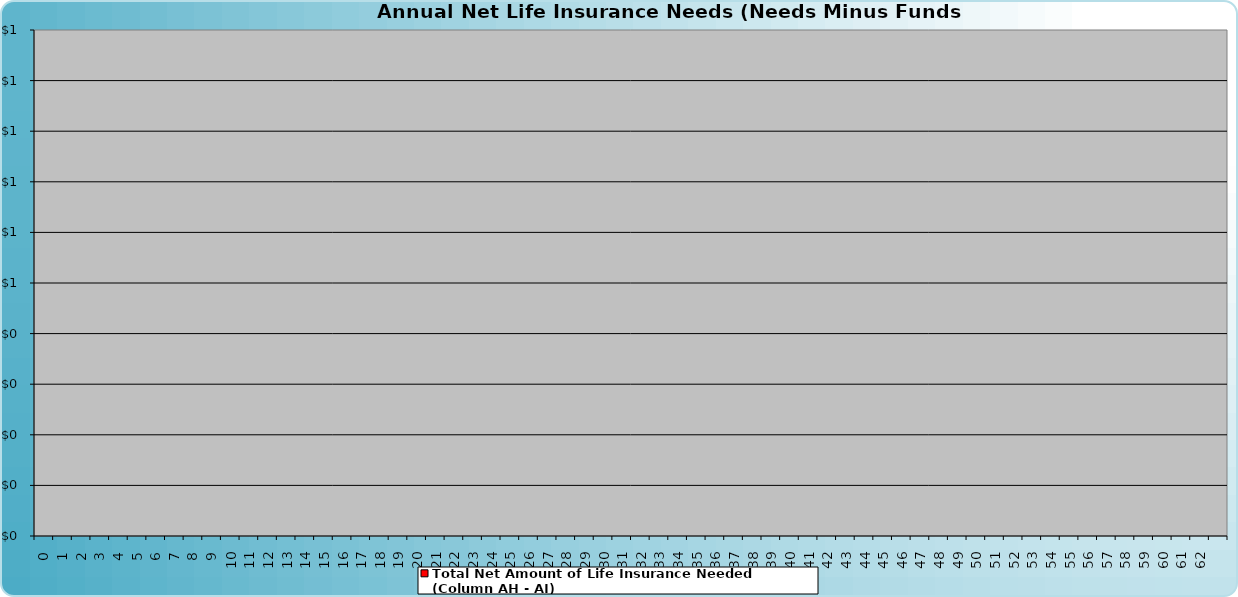
| Category | Total Net Amount of Life Insurance Needed (Column AH - AI) |
|---|---|
| 0.0 | 0 |
| 1.0 | 0 |
| 2.0 | 0 |
| 3.0 | 0 |
| 4.0 | 0 |
| 5.0 | 0 |
| 6.0 | 0 |
| 7.0 | 0 |
| 8.0 | 0 |
| 9.0 | 0 |
| 10.0 | 0 |
| 11.0 | 0 |
| 12.0 | 0 |
| 13.0 | 0 |
| 14.0 | 0 |
| 15.0 | 0 |
| 16.0 | 0 |
| 17.0 | 0 |
| 18.0 | 0 |
| 19.0 | 0 |
| 20.0 | 0 |
| 21.0 | 0 |
| 22.0 | 0 |
| 23.0 | 0 |
| 24.0 | 0 |
| 25.0 | 0 |
| 26.0 | 0 |
| 27.0 | 0 |
| 28.0 | 0 |
| 29.0 | 0 |
| 30.0 | 0 |
| 31.0 | 0 |
| 32.0 | 0 |
| 33.0 | 0 |
| 34.0 | 0 |
| 35.0 | 0 |
| 36.0 | 0 |
| 37.0 | 0 |
| 38.0 | 0 |
| 39.0 | 0 |
| 40.0 | 0 |
| 41.0 | 0 |
| 42.0 | 0 |
| 43.0 | 0 |
| 44.0 | 0 |
| 45.0 | 0 |
| 46.0 | 0 |
| 47.0 | 0 |
| 48.0 | 0 |
| 49.0 | 0 |
| 50.0 | 0 |
| 51.0 | 0 |
| 52.0 | 0 |
| 53.0 | 0 |
| 54.0 | 0 |
| 55.0 | 0 |
| 56.0 | 0 |
| 57.0 | 0 |
| 58.0 | 0 |
| 59.0 | 0 |
| 60.0 | 0 |
| 61.0 | 0 |
| 62.0 | 0 |